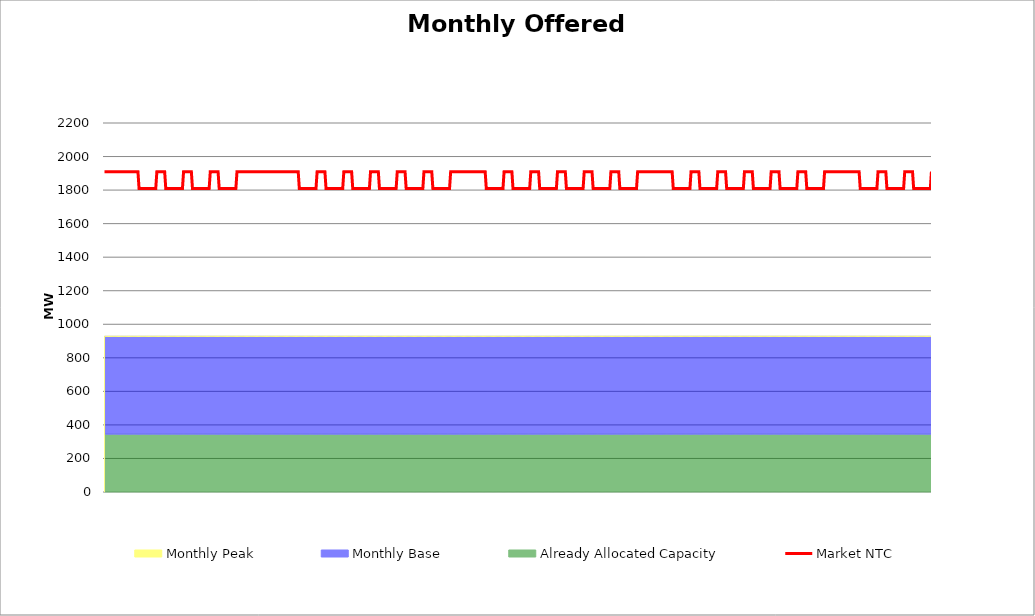
| Category | Market NTC |
|---|---|
| 0 | 1910 |
| 1 | 1910 |
| 2 | 1910 |
| 3 | 1910 |
| 4 | 1910 |
| 5 | 1910 |
| 6 | 1910 |
| 7 | 1910 |
| 8 | 1910 |
| 9 | 1910 |
| 10 | 1910 |
| 11 | 1910 |
| 12 | 1910 |
| 13 | 1910 |
| 14 | 1910 |
| 15 | 1910 |
| 16 | 1910 |
| 17 | 1910 |
| 18 | 1910 |
| 19 | 1910 |
| 20 | 1910 |
| 21 | 1910 |
| 22 | 1910 |
| 23 | 1910 |
| 24 | 1910 |
| 25 | 1910 |
| 26 | 1910 |
| 27 | 1910 |
| 28 | 1910 |
| 29 | 1910 |
| 30 | 1910 |
| 31 | 1810 |
| 32 | 1810 |
| 33 | 1810 |
| 34 | 1810 |
| 35 | 1810 |
| 36 | 1810 |
| 37 | 1810 |
| 38 | 1810 |
| 39 | 1810 |
| 40 | 1810 |
| 41 | 1810 |
| 42 | 1810 |
| 43 | 1810 |
| 44 | 1810 |
| 45 | 1810 |
| 46 | 1810 |
| 47 | 1910 |
| 48 | 1910 |
| 49 | 1910 |
| 50 | 1910 |
| 51 | 1910 |
| 52 | 1910 |
| 53 | 1910 |
| 54 | 1910 |
| 55 | 1810 |
| 56 | 1810 |
| 57 | 1810 |
| 58 | 1810 |
| 59 | 1810 |
| 60 | 1810 |
| 61 | 1810 |
| 62 | 1810 |
| 63 | 1810 |
| 64 | 1810 |
| 65 | 1810 |
| 66 | 1810 |
| 67 | 1810 |
| 68 | 1810 |
| 69 | 1810 |
| 70 | 1810 |
| 71 | 1910 |
| 72 | 1910 |
| 73 | 1910 |
| 74 | 1910 |
| 75 | 1910 |
| 76 | 1910 |
| 77 | 1910 |
| 78 | 1910 |
| 79 | 1810 |
| 80 | 1810 |
| 81 | 1810 |
| 82 | 1810 |
| 83 | 1810 |
| 84 | 1810 |
| 85 | 1810 |
| 86 | 1810 |
| 87 | 1810 |
| 88 | 1810 |
| 89 | 1810 |
| 90 | 1810 |
| 91 | 1810 |
| 92 | 1810 |
| 93 | 1810 |
| 94 | 1810 |
| 95 | 1910 |
| 96 | 1910 |
| 97 | 1910 |
| 98 | 1910 |
| 99 | 1910 |
| 100 | 1910 |
| 101 | 1910 |
| 102 | 1910 |
| 103 | 1810 |
| 104 | 1810 |
| 105 | 1810 |
| 106 | 1810 |
| 107 | 1810 |
| 108 | 1810 |
| 109 | 1810 |
| 110 | 1810 |
| 111 | 1810 |
| 112 | 1810 |
| 113 | 1810 |
| 114 | 1810 |
| 115 | 1810 |
| 116 | 1810 |
| 117 | 1810 |
| 118 | 1810 |
| 119 | 1910 |
| 120 | 1910 |
| 121 | 1910 |
| 122 | 1910 |
| 123 | 1910 |
| 124 | 1910 |
| 125 | 1910 |
| 126 | 1910 |
| 127 | 1910 |
| 128 | 1910 |
| 129 | 1910 |
| 130 | 1910 |
| 131 | 1910 |
| 132 | 1910 |
| 133 | 1910 |
| 134 | 1910 |
| 135 | 1910 |
| 136 | 1910 |
| 137 | 1910 |
| 138 | 1910 |
| 139 | 1910 |
| 140 | 1910 |
| 141 | 1910 |
| 142 | 1910 |
| 143 | 1910 |
| 144 | 1910 |
| 145 | 1910 |
| 146 | 1910 |
| 147 | 1910 |
| 148 | 1910 |
| 149 | 1910 |
| 150 | 1910 |
| 151 | 1910 |
| 152 | 1910 |
| 153 | 1910 |
| 154 | 1910 |
| 155 | 1910 |
| 156 | 1910 |
| 157 | 1910 |
| 158 | 1910 |
| 159 | 1910 |
| 160 | 1910 |
| 161 | 1910 |
| 162 | 1910 |
| 163 | 1910 |
| 164 | 1910 |
| 165 | 1910 |
| 166 | 1910 |
| 167 | 1910 |
| 168 | 1910 |
| 169 | 1910 |
| 170 | 1910 |
| 171 | 1910 |
| 172 | 1910 |
| 173 | 1910 |
| 174 | 1910 |
| 175 | 1810 |
| 176 | 1810 |
| 177 | 1810 |
| 178 | 1810 |
| 179 | 1810 |
| 180 | 1810 |
| 181 | 1810 |
| 182 | 1810 |
| 183 | 1810 |
| 184 | 1810 |
| 185 | 1810 |
| 186 | 1810 |
| 187 | 1810 |
| 188 | 1810 |
| 189 | 1810 |
| 190 | 1810 |
| 191 | 1910 |
| 192 | 1910 |
| 193 | 1910 |
| 194 | 1910 |
| 195 | 1910 |
| 196 | 1910 |
| 197 | 1910 |
| 198 | 1910 |
| 199 | 1810 |
| 200 | 1810 |
| 201 | 1810 |
| 202 | 1810 |
| 203 | 1810 |
| 204 | 1810 |
| 205 | 1810 |
| 206 | 1810 |
| 207 | 1810 |
| 208 | 1810 |
| 209 | 1810 |
| 210 | 1810 |
| 211 | 1810 |
| 212 | 1810 |
| 213 | 1810 |
| 214 | 1810 |
| 215 | 1910 |
| 216 | 1910 |
| 217 | 1910 |
| 218 | 1910 |
| 219 | 1910 |
| 220 | 1910 |
| 221 | 1910 |
| 222 | 1910 |
| 223 | 1810 |
| 224 | 1810 |
| 225 | 1810 |
| 226 | 1810 |
| 227 | 1810 |
| 228 | 1810 |
| 229 | 1810 |
| 230 | 1810 |
| 231 | 1810 |
| 232 | 1810 |
| 233 | 1810 |
| 234 | 1810 |
| 235 | 1810 |
| 236 | 1810 |
| 237 | 1810 |
| 238 | 1810 |
| 239 | 1910 |
| 240 | 1910 |
| 241 | 1910 |
| 242 | 1910 |
| 243 | 1910 |
| 244 | 1910 |
| 245 | 1910 |
| 246 | 1910 |
| 247 | 1810 |
| 248 | 1810 |
| 249 | 1810 |
| 250 | 1810 |
| 251 | 1810 |
| 252 | 1810 |
| 253 | 1810 |
| 254 | 1810 |
| 255 | 1810 |
| 256 | 1810 |
| 257 | 1810 |
| 258 | 1810 |
| 259 | 1810 |
| 260 | 1810 |
| 261 | 1810 |
| 262 | 1810 |
| 263 | 1910 |
| 264 | 1910 |
| 265 | 1910 |
| 266 | 1910 |
| 267 | 1910 |
| 268 | 1910 |
| 269 | 1910 |
| 270 | 1910 |
| 271 | 1810 |
| 272 | 1810 |
| 273 | 1810 |
| 274 | 1810 |
| 275 | 1810 |
| 276 | 1810 |
| 277 | 1810 |
| 278 | 1810 |
| 279 | 1810 |
| 280 | 1810 |
| 281 | 1810 |
| 282 | 1810 |
| 283 | 1810 |
| 284 | 1810 |
| 285 | 1810 |
| 286 | 1810 |
| 287 | 1910 |
| 288 | 1910 |
| 289 | 1910 |
| 290 | 1910 |
| 291 | 1910 |
| 292 | 1910 |
| 293 | 1910 |
| 294 | 1910 |
| 295 | 1810 |
| 296 | 1810 |
| 297 | 1810 |
| 298 | 1810 |
| 299 | 1810 |
| 300 | 1810 |
| 301 | 1810 |
| 302 | 1810 |
| 303 | 1810 |
| 304 | 1810 |
| 305 | 1810 |
| 306 | 1810 |
| 307 | 1810 |
| 308 | 1810 |
| 309 | 1810 |
| 310 | 1810 |
| 311 | 1910 |
| 312 | 1910 |
| 313 | 1910 |
| 314 | 1910 |
| 315 | 1910 |
| 316 | 1910 |
| 317 | 1910 |
| 318 | 1910 |
| 319 | 1910 |
| 320 | 1910 |
| 321 | 1910 |
| 322 | 1910 |
| 323 | 1910 |
| 324 | 1910 |
| 325 | 1910 |
| 326 | 1910 |
| 327 | 1910 |
| 328 | 1910 |
| 329 | 1910 |
| 330 | 1910 |
| 331 | 1910 |
| 332 | 1910 |
| 333 | 1910 |
| 334 | 1910 |
| 335 | 1910 |
| 336 | 1910 |
| 337 | 1910 |
| 338 | 1910 |
| 339 | 1910 |
| 340 | 1910 |
| 341 | 1910 |
| 342 | 1910 |
| 343 | 1810 |
| 344 | 1810 |
| 345 | 1810 |
| 346 | 1810 |
| 347 | 1810 |
| 348 | 1810 |
| 349 | 1810 |
| 350 | 1810 |
| 351 | 1810 |
| 352 | 1810 |
| 353 | 1810 |
| 354 | 1810 |
| 355 | 1810 |
| 356 | 1810 |
| 357 | 1810 |
| 358 | 1810 |
| 359 | 1910 |
| 360 | 1910 |
| 361 | 1910 |
| 362 | 1910 |
| 363 | 1910 |
| 364 | 1910 |
| 365 | 1910 |
| 366 | 1910 |
| 367 | 1810 |
| 368 | 1810 |
| 369 | 1810 |
| 370 | 1810 |
| 371 | 1810 |
| 372 | 1810 |
| 373 | 1810 |
| 374 | 1810 |
| 375 | 1810 |
| 376 | 1810 |
| 377 | 1810 |
| 378 | 1810 |
| 379 | 1810 |
| 380 | 1810 |
| 381 | 1810 |
| 382 | 1810 |
| 383 | 1910 |
| 384 | 1910 |
| 385 | 1910 |
| 386 | 1910 |
| 387 | 1910 |
| 388 | 1910 |
| 389 | 1910 |
| 390 | 1910 |
| 391 | 1810 |
| 392 | 1810 |
| 393 | 1810 |
| 394 | 1810 |
| 395 | 1810 |
| 396 | 1810 |
| 397 | 1810 |
| 398 | 1810 |
| 399 | 1810 |
| 400 | 1810 |
| 401 | 1810 |
| 402 | 1810 |
| 403 | 1810 |
| 404 | 1810 |
| 405 | 1810 |
| 406 | 1810 |
| 407 | 1910 |
| 408 | 1910 |
| 409 | 1910 |
| 410 | 1910 |
| 411 | 1910 |
| 412 | 1910 |
| 413 | 1910 |
| 414 | 1910 |
| 415 | 1810 |
| 416 | 1810 |
| 417 | 1810 |
| 418 | 1810 |
| 419 | 1810 |
| 420 | 1810 |
| 421 | 1810 |
| 422 | 1810 |
| 423 | 1810 |
| 424 | 1810 |
| 425 | 1810 |
| 426 | 1810 |
| 427 | 1810 |
| 428 | 1810 |
| 429 | 1810 |
| 430 | 1810 |
| 431 | 1910 |
| 432 | 1910 |
| 433 | 1910 |
| 434 | 1910 |
| 435 | 1910 |
| 436 | 1910 |
| 437 | 1910 |
| 438 | 1910 |
| 439 | 1810 |
| 440 | 1810 |
| 441 | 1810 |
| 442 | 1810 |
| 443 | 1810 |
| 444 | 1810 |
| 445 | 1810 |
| 446 | 1810 |
| 447 | 1810 |
| 448 | 1810 |
| 449 | 1810 |
| 450 | 1810 |
| 451 | 1810 |
| 452 | 1810 |
| 453 | 1810 |
| 454 | 1810 |
| 455 | 1910 |
| 456 | 1910 |
| 457 | 1910 |
| 458 | 1910 |
| 459 | 1910 |
| 460 | 1910 |
| 461 | 1910 |
| 462 | 1910 |
| 463 | 1810 |
| 464 | 1810 |
| 465 | 1810 |
| 466 | 1810 |
| 467 | 1810 |
| 468 | 1810 |
| 469 | 1810 |
| 470 | 1810 |
| 471 | 1810 |
| 472 | 1810 |
| 473 | 1810 |
| 474 | 1810 |
| 475 | 1810 |
| 476 | 1810 |
| 477 | 1810 |
| 478 | 1810 |
| 479 | 1910 |
| 480 | 1910 |
| 481 | 1910 |
| 482 | 1910 |
| 483 | 1910 |
| 484 | 1910 |
| 485 | 1910 |
| 486 | 1910 |
| 487 | 1910 |
| 488 | 1910 |
| 489 | 1910 |
| 490 | 1910 |
| 491 | 1910 |
| 492 | 1910 |
| 493 | 1910 |
| 494 | 1910 |
| 495 | 1910 |
| 496 | 1910 |
| 497 | 1910 |
| 498 | 1910 |
| 499 | 1910 |
| 500 | 1910 |
| 501 | 1910 |
| 502 | 1910 |
| 503 | 1910 |
| 504 | 1910 |
| 505 | 1910 |
| 506 | 1910 |
| 507 | 1910 |
| 508 | 1910 |
| 509 | 1910 |
| 510 | 1910 |
| 511 | 1810 |
| 512 | 1810 |
| 513 | 1810 |
| 514 | 1810 |
| 515 | 1810 |
| 516 | 1810 |
| 517 | 1810 |
| 518 | 1810 |
| 519 | 1810 |
| 520 | 1810 |
| 521 | 1810 |
| 522 | 1810 |
| 523 | 1810 |
| 524 | 1810 |
| 525 | 1810 |
| 526 | 1810 |
| 527 | 1910 |
| 528 | 1910 |
| 529 | 1910 |
| 530 | 1910 |
| 531 | 1910 |
| 532 | 1910 |
| 533 | 1910 |
| 534 | 1910 |
| 535 | 1810 |
| 536 | 1810 |
| 537 | 1810 |
| 538 | 1810 |
| 539 | 1810 |
| 540 | 1810 |
| 541 | 1810 |
| 542 | 1810 |
| 543 | 1810 |
| 544 | 1810 |
| 545 | 1810 |
| 546 | 1810 |
| 547 | 1810 |
| 548 | 1810 |
| 549 | 1810 |
| 550 | 1810 |
| 551 | 1910 |
| 552 | 1910 |
| 553 | 1910 |
| 554 | 1910 |
| 555 | 1910 |
| 556 | 1910 |
| 557 | 1910 |
| 558 | 1910 |
| 559 | 1810 |
| 560 | 1810 |
| 561 | 1810 |
| 562 | 1810 |
| 563 | 1810 |
| 564 | 1810 |
| 565 | 1810 |
| 566 | 1810 |
| 567 | 1810 |
| 568 | 1810 |
| 569 | 1810 |
| 570 | 1810 |
| 571 | 1810 |
| 572 | 1810 |
| 573 | 1810 |
| 574 | 1810 |
| 575 | 1910 |
| 576 | 1910 |
| 577 | 1910 |
| 578 | 1910 |
| 579 | 1910 |
| 580 | 1910 |
| 581 | 1910 |
| 582 | 1910 |
| 583 | 1810 |
| 584 | 1810 |
| 585 | 1810 |
| 586 | 1810 |
| 587 | 1810 |
| 588 | 1810 |
| 589 | 1810 |
| 590 | 1810 |
| 591 | 1810 |
| 592 | 1810 |
| 593 | 1810 |
| 594 | 1810 |
| 595 | 1810 |
| 596 | 1810 |
| 597 | 1810 |
| 598 | 1810 |
| 599 | 1910 |
| 600 | 1910 |
| 601 | 1910 |
| 602 | 1910 |
| 603 | 1910 |
| 604 | 1910 |
| 605 | 1910 |
| 606 | 1910 |
| 607 | 1810 |
| 608 | 1810 |
| 609 | 1810 |
| 610 | 1810 |
| 611 | 1810 |
| 612 | 1810 |
| 613 | 1810 |
| 614 | 1810 |
| 615 | 1810 |
| 616 | 1810 |
| 617 | 1810 |
| 618 | 1810 |
| 619 | 1810 |
| 620 | 1810 |
| 621 | 1810 |
| 622 | 1810 |
| 623 | 1910 |
| 624 | 1910 |
| 625 | 1910 |
| 626 | 1910 |
| 627 | 1910 |
| 628 | 1910 |
| 629 | 1910 |
| 630 | 1910 |
| 631 | 1810 |
| 632 | 1810 |
| 633 | 1810 |
| 634 | 1810 |
| 635 | 1810 |
| 636 | 1810 |
| 637 | 1810 |
| 638 | 1810 |
| 639 | 1810 |
| 640 | 1810 |
| 641 | 1810 |
| 642 | 1810 |
| 643 | 1810 |
| 644 | 1810 |
| 645 | 1810 |
| 646 | 1810 |
| 647 | 1910 |
| 648 | 1910 |
| 649 | 1910 |
| 650 | 1910 |
| 651 | 1910 |
| 652 | 1910 |
| 653 | 1910 |
| 654 | 1910 |
| 655 | 1910 |
| 656 | 1910 |
| 657 | 1910 |
| 658 | 1910 |
| 659 | 1910 |
| 660 | 1910 |
| 661 | 1910 |
| 662 | 1910 |
| 663 | 1910 |
| 664 | 1910 |
| 665 | 1910 |
| 666 | 1910 |
| 667 | 1910 |
| 668 | 1910 |
| 669 | 1910 |
| 670 | 1910 |
| 671 | 1910 |
| 672 | 1910 |
| 673 | 1910 |
| 674 | 1910 |
| 675 | 1910 |
| 676 | 1910 |
| 677 | 1910 |
| 678 | 1910 |
| 679 | 1810 |
| 680 | 1810 |
| 681 | 1810 |
| 682 | 1810 |
| 683 | 1810 |
| 684 | 1810 |
| 685 | 1810 |
| 686 | 1810 |
| 687 | 1810 |
| 688 | 1810 |
| 689 | 1810 |
| 690 | 1810 |
| 691 | 1810 |
| 692 | 1810 |
| 693 | 1810 |
| 694 | 1810 |
| 695 | 1910 |
| 696 | 1910 |
| 697 | 1910 |
| 698 | 1910 |
| 699 | 1910 |
| 700 | 1910 |
| 701 | 1910 |
| 702 | 1910 |
| 703 | 1810 |
| 704 | 1810 |
| 705 | 1810 |
| 706 | 1810 |
| 707 | 1810 |
| 708 | 1810 |
| 709 | 1810 |
| 710 | 1810 |
| 711 | 1810 |
| 712 | 1810 |
| 713 | 1810 |
| 714 | 1810 |
| 715 | 1810 |
| 716 | 1810 |
| 717 | 1810 |
| 718 | 1810 |
| 719 | 1910 |
| 720 | 1910 |
| 721 | 1910 |
| 722 | 1910 |
| 723 | 1910 |
| 724 | 1910 |
| 725 | 1910 |
| 726 | 1910 |
| 727 | 1810 |
| 728 | 1810 |
| 729 | 1810 |
| 730 | 1810 |
| 731 | 1810 |
| 732 | 1810 |
| 733 | 1810 |
| 734 | 1810 |
| 735 | 1810 |
| 736 | 1810 |
| 737 | 1810 |
| 738 | 1810 |
| 739 | 1810 |
| 740 | 1810 |
| 741 | 1810 |
| 742 | 1810 |
| 743 | 1910 |